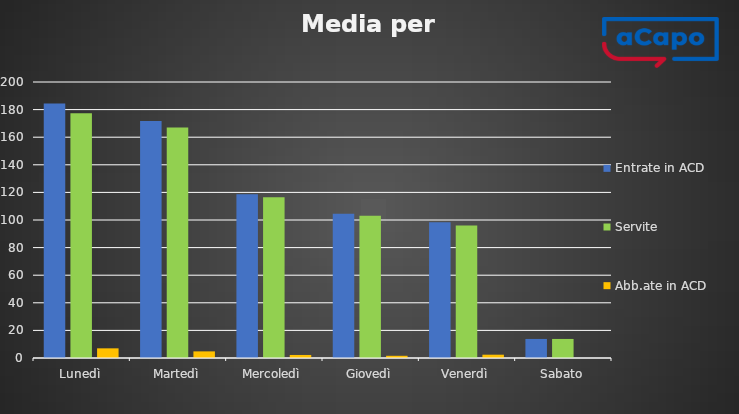
| Category | Entrate in ACD | Servite | Abb.ate in ACD |
|---|---|---|---|
| Lunedì | 184.4 | 177.4 | 7 |
| Martedì | 171.8 | 167 | 4.8 |
| Mercoledì | 118.6 | 116.4 | 2.2 |
| Giovedì | 104.6 | 103 | 1.6 |
| Venerdì | 98.4 | 96 | 2.4 |
| Sabato | 13.8 | 13.8 | 0 |